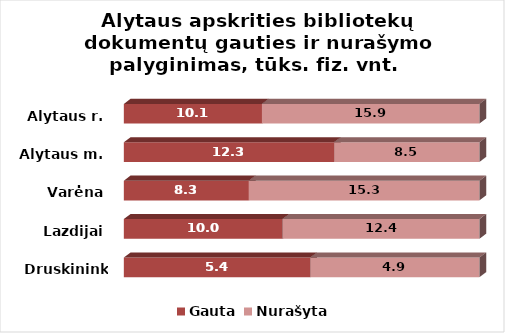
| Category | Gauta | Nurašyta |
|---|---|---|
| Druskininkai | 5.4 | 4.9 |
| Lazdijai | 10 | 12.4 |
| Varėna | 8.3 | 15.3 |
| Alytaus m. | 12.3 | 8.5 |
| Alytaus r. | 10.1 | 15.9 |